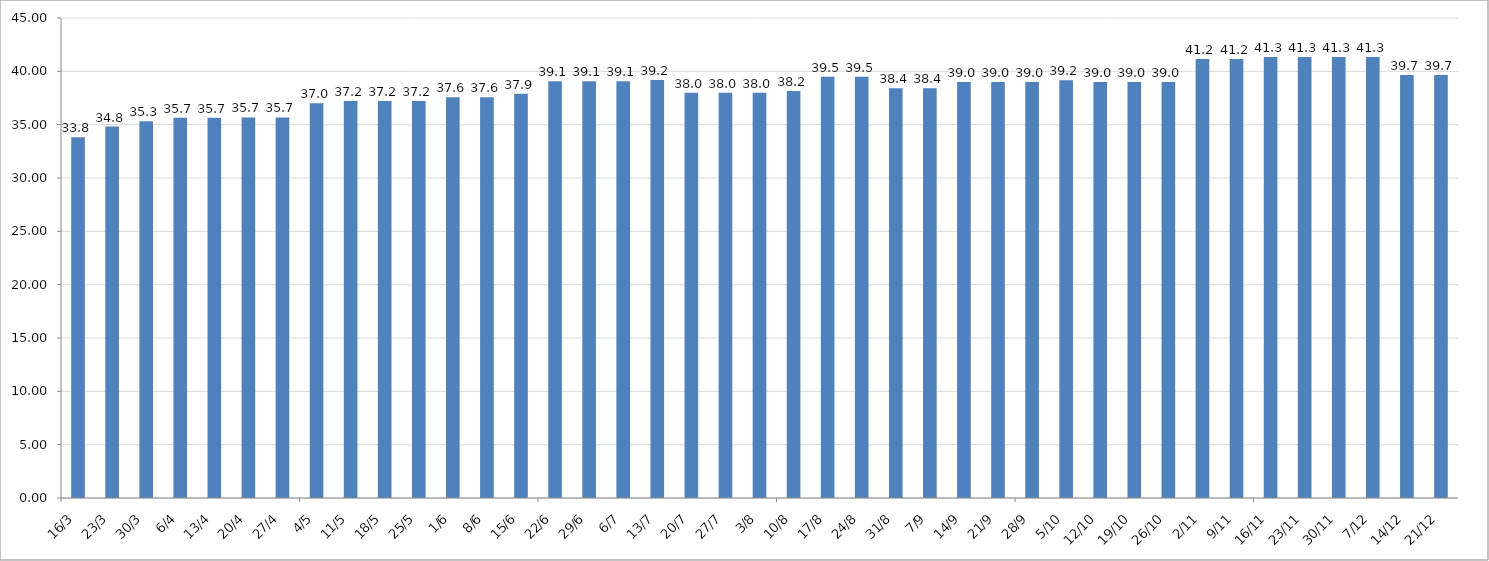
| Category | Series 0 |
|---|---|
| 2020-03-16 | 33.817 |
| 2020-03-23 | 34.817 |
| 2020-03-30 | 35.317 |
| 2020-04-06 | 35.65 |
| 2020-04-13 | 35.65 |
| 2020-04-20 | 35.683 |
| 2020-04-27 | 35.683 |
| 2020-05-04 | 37.017 |
| 2020-05-11 | 37.208 |
| 2020-05-18 | 37.208 |
| 2020-05-25 | 37.208 |
| 2020-06-01 | 37.567 |
| 2020-06-08 | 37.567 |
| 2020-06-15 | 37.9 |
| 2020-06-22 | 39.067 |
| 2020-06-29 | 39.067 |
| 2020-07-06 | 39.067 |
| 2020-07-13 | 39.192 |
| 2020-07-20 | 37.983 |
| 2020-07-27 | 37.983 |
| 2020-08-03 | 37.983 |
| 2020-08-10 | 38.15 |
| 2020-08-17 | 39.483 |
| 2020-08-24 | 39.483 |
| 2020-08-31 | 38.425 |
| 2020-09-07 | 38.425 |
| 2020-09-14 | 39 |
| 2020-09-21 | 39 |
| 2020-09-28 | 39 |
| 2020-10-05 | 39.167 |
| 2020-10-12 | 39 |
| 2020-10-19 | 39 |
| 2020-10-26 | 39 |
| 2020-11-02 | 41.15 |
| 2020-11-09 | 41.15 |
| 2020-11-16 | 41.333 |
| 2020-11-23 | 41.333 |
| 2020-11-30 | 41.333 |
| 2020-12-07 | 41.333 |
| 2020-12-14 | 39.667 |
| 2020-12-21 | 39.667 |